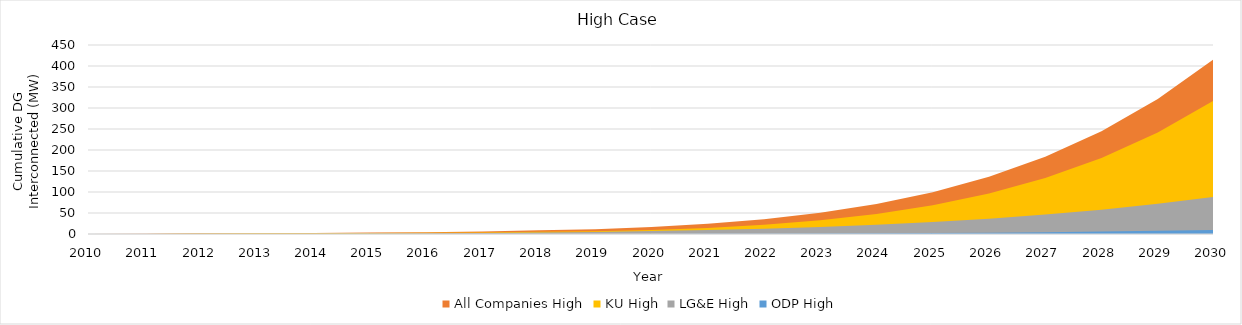
| Category | All Companies High | KU High | LG&E High | ODP High |
|---|---|---|---|---|
| 2010.0 | 0.25 | 0.11 | 0.139 | 0 |
| 2011.0 | 0.41 | 0.155 | 0.256 | 0 |
| 2012.0 | 1.776 | 1.437 | 0.327 | 0.012 |
| 2013.0 | 2.052 | 1.527 | 0.514 | 0.012 |
| 2014.0 | 2.507 | 1.7 | 0.796 | 0.012 |
| 2015.0 | 3.342 | 2.17 | 1.161 | 0.012 |
| 2016.0 | 4.238 | 2.706 | 1.505 | 0.027 |
| 2017.0 | 5.964 | 3.315 | 2.613 | 0.036 |
| 2018.0 | 8.998 | 5.091 | 3.862 | 0.045 |
| 2019.0 | 11.501 | 6.335 | 4.965 | 0.201 |
| 2020.0 | 16.751 | 9.494 | 6.977 | 0.28 |
| 2021.0 | 24.42 | 14.42 | 9.527 | 0.473 |
| 2022.0 | 35.281 | 21.755 | 12.776 | 0.739 |
| 2023.0 | 50.504 | 32.459 | 16.908 | 1.112 |
| 2024.0 | 71.362 | 47.6 | 22.101 | 1.62 |
| 2025.0 | 99.353 | 68.442 | 28.554 | 2.294 |
| 2026.0 | 136.216 | 96.463 | 36.493 | 3.173 |
| 2027.0 | 183.953 | 133.371 | 46.167 | 4.299 |
| 2028.0 | 244.844 | 181.119 | 57.855 | 5.719 |
| 2029.0 | 321.465 | 241.924 | 71.864 | 7.486 |
| 2030.0 | 416.707 | 318.279 | 88.53 | 9.659 |